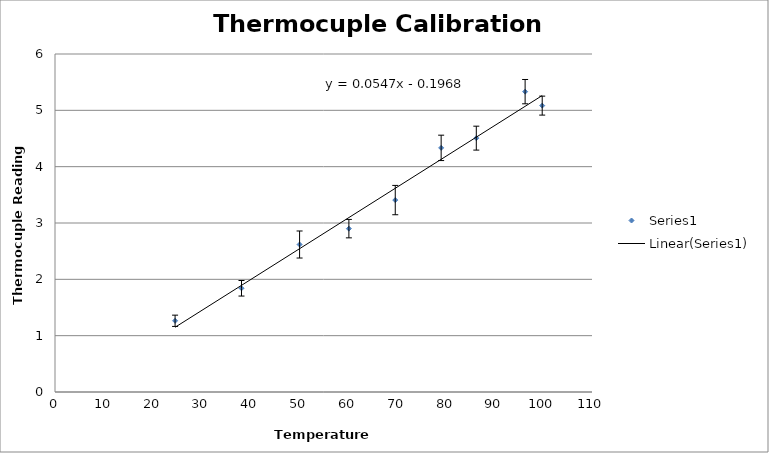
| Category | Series 0 |
|---|---|
| 24.6 | 1.264 |
| 38.2 | 1.841 |
| 50.1 | 2.618 |
| 60.2 | 2.9 |
| 69.7 | 3.407 |
| 79.1 | 4.334 |
| 86.3 | 4.506 |
| 96.3 | 5.332 |
| 99.8 | 5.084 |